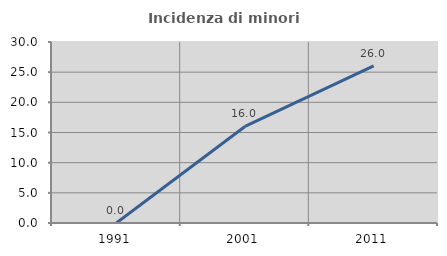
| Category | Incidenza di minori stranieri |
|---|---|
| 1991.0 | 0 |
| 2001.0 | 16 |
| 2011.0 | 26.027 |